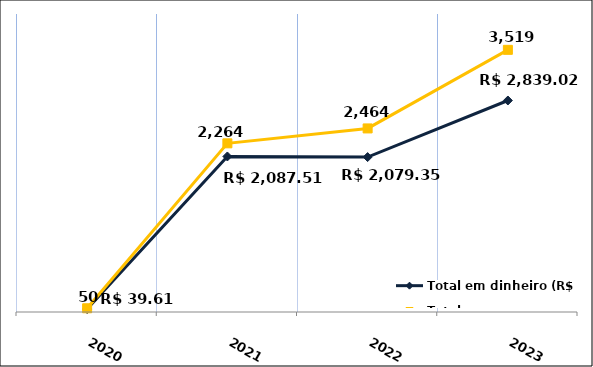
| Category | Total em dinheiro (R$) |
|---|---|
| 2020.0 | 39.61 |
| 2021.0 | 2087.51 |
| 2022.0 | 2079.35 |
| 2023.0 | 2839.02 |